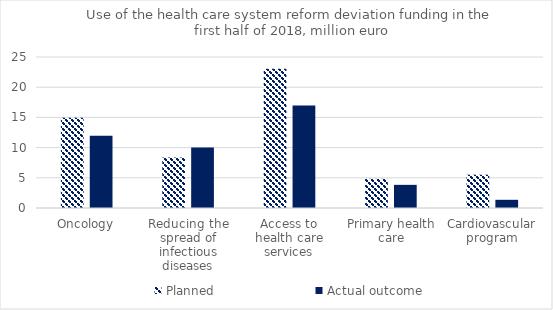
| Category | Planned | Actual outcome |
|---|---|---|
| Oncology | 14.948 | 11.953 |
| Reducing the spread of infectious diseases | 8.37 | 10.022 |
| Access to health care services | 23.037 | 16.956 |
| Primary health care | 4.832 | 3.833 |
| Cardiovascular program | 5.513 | 1.356 |